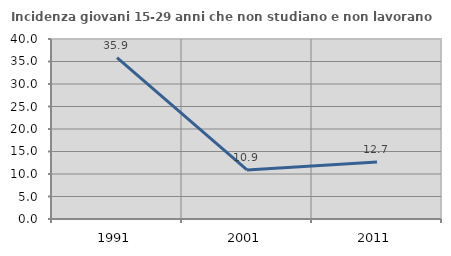
| Category | Incidenza giovani 15-29 anni che non studiano e non lavorano  |
|---|---|
| 1991.0 | 35.851 |
| 2001.0 | 10.913 |
| 2011.0 | 12.653 |